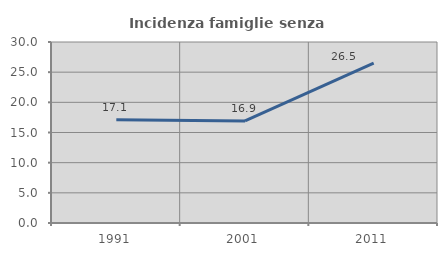
| Category | Incidenza famiglie senza nuclei |
|---|---|
| 1991.0 | 17.093 |
| 2001.0 | 16.912 |
| 2011.0 | 26.482 |